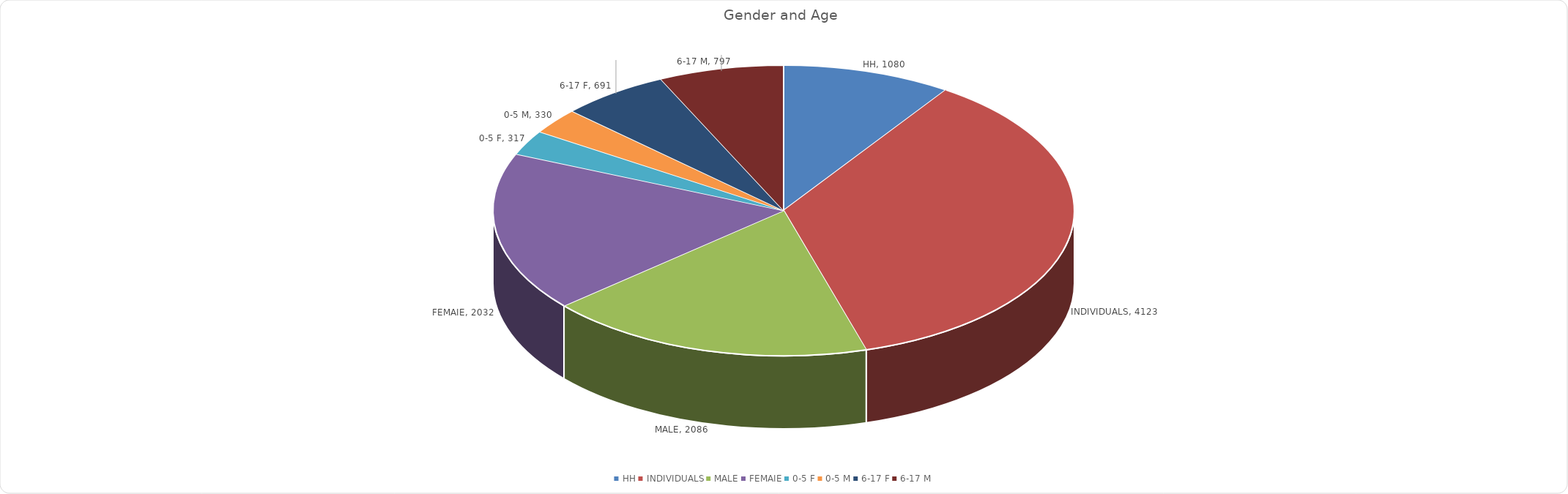
| Category | Numbers |
|---|---|
| HH | 1080 |
| INDIVIDUALS | 4123 |
| MALE | 2086 |
| FEMAIE | 2032 |
| 0-5 F | 317 |
| 0-5 M | 330 |
| 6-17 F | 691 |
| 6-17 M | 797 |